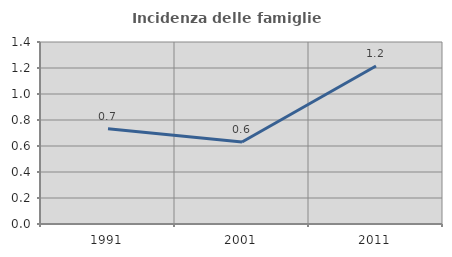
| Category | Incidenza delle famiglie numerose |
|---|---|
| 1991.0 | 0.733 |
| 2001.0 | 0.631 |
| 2011.0 | 1.215 |